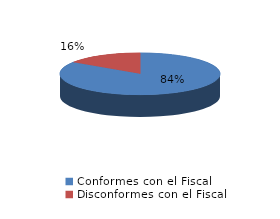
| Category | Series 0 |
|---|---|
| 0 | 141 |
| 1 | 26 |